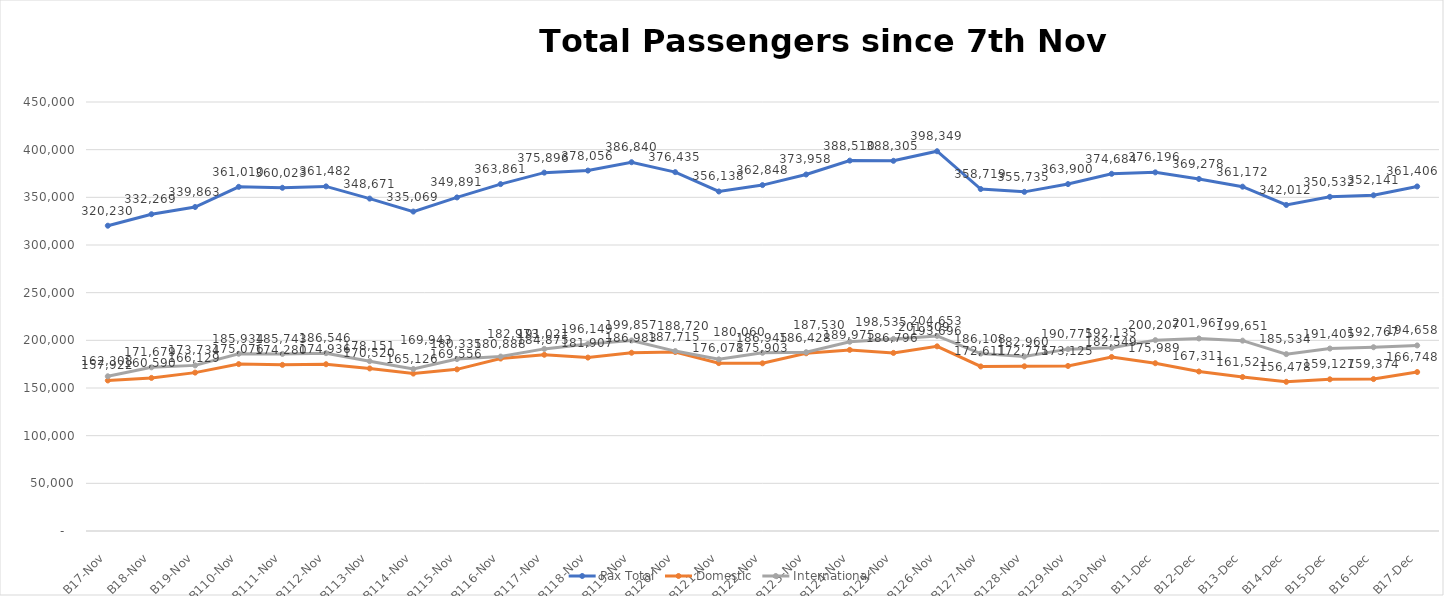
| Category | Pax Total | Domestic | International |
|---|---|---|---|
| 2023-11-07 | 320230 | 157922 | 162308 |
| 2023-11-08 | 332269 | 160590 | 171679 |
| 2023-11-09 | 339863 | 166129 | 173734 |
| 2023-11-10 | 361010 | 175076 | 185934 |
| 2023-11-11 | 360023 | 174280 | 185743 |
| 2023-11-12 | 361482 | 174936 | 186546 |
| 2023-11-13 | 348671 | 170520 | 178151 |
| 2023-11-14 | 335069 | 165126 | 169943 |
| 2023-11-15 | 349891 | 169556 | 180335 |
| 2023-11-16 | 363861 | 180888 | 182973 |
| 2023-11-17 | 375896 | 184875 | 191021 |
| 2023-11-18 | 378056 | 181907 | 196149 |
| 2023-11-19 | 386840 | 186983 | 199857 |
| 2023-11-20 | 376435 | 187715 | 188720 |
| 2023-11-21 | 356138 | 176078 | 180060 |
| 2023-11-22 | 362848 | 175903 | 186945 |
| 2023-11-23 | 373958 | 186428 | 187530 |
| 2023-11-24 | 388510 | 189975 | 198535 |
| 2023-11-25 | 388305 | 186796 | 201509 |
| 2023-11-26 | 398349 | 193696 | 204653 |
| 2023-11-27 | 358719 | 172611 | 186108 |
| 2023-11-28 | 355735 | 172775 | 182960 |
| 2023-11-29 | 363900 | 173125 | 190775 |
| 2023-11-30 | 374684 | 182549 | 192135 |
| 2023-12-01 | 376196 | 175989 | 200207 |
| 2023-12-02 | 369278 | 167311 | 201967 |
| 2023-12-03 | 361172 | 161521 | 199651 |
| 2023-12-04 | 342012 | 156478 | 185534 |
| 2023-12-05 | 350532 | 159127 | 191405 |
| 2023-12-06 | 352141 | 159374 | 192767 |
| 2023-12-07 | 361406 | 166748 | 194658 |